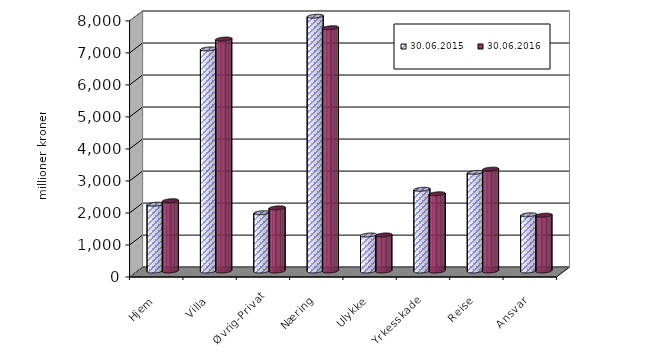
| Category | 30.06.2015 | 30.06.2016 |
|---|---|---|
| Hjem | 2086.686 | 2194.61 |
| Villa | 6935.602 | 7244.72 |
| Øvrig-Privat | 1820.929 | 1971.883 |
| Næring | 7958.27 | 7597.929 |
| Ulykke | 1124.688 | 1125.791 |
| Yrkesskade | 2553.225 | 2411.739 |
| Reise | 3080.139 | 3181.323 |
| Ansvar | 1755.221 | 1743.253 |